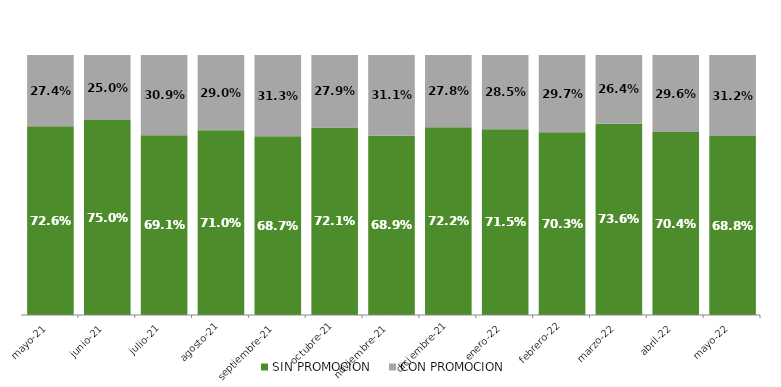
| Category | SIN PROMOCION   | CON PROMOCION   |
|---|---|---|
| 2021-05-01 | 0.726 | 0.274 |
| 2021-06-01 | 0.75 | 0.25 |
| 2021-07-01 | 0.691 | 0.309 |
| 2021-08-01 | 0.71 | 0.29 |
| 2021-09-01 | 0.687 | 0.313 |
| 2021-10-01 | 0.721 | 0.279 |
| 2021-11-01 | 0.689 | 0.311 |
| 2021-12-01 | 0.722 | 0.278 |
| 2022-01-01 | 0.715 | 0.285 |
| 2022-02-01 | 0.703 | 0.297 |
| 2022-03-01 | 0.736 | 0.264 |
| 2022-04-01 | 0.704 | 0.296 |
| 2022-05-01 | 0.688 | 0.312 |